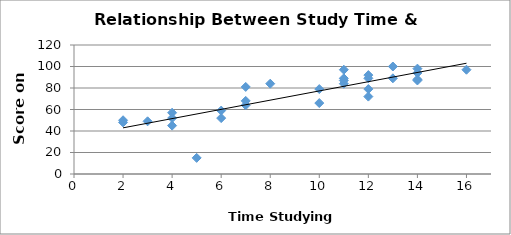
| Category | Score on Test |
|---|---|
| 3.0 | 49 |
| 11.0 | 87 |
| 2.0 | 50 |
| 13.0 | 89 |
| 8.0 | 84 |
| 12.0 | 79 |
| 13.0 | 100 |
| 4.0 | 57 |
| 7.0 | 64 |
| 14.0 | 98 |
| 7.0 | 81 |
| 7.0 | 68 |
| 14.0 | 88 |
| 4.0 | 45 |
| 4.0 | 52 |
| 5.0 | 15 |
| 12.0 | 72 |
| 16.0 | 97 |
| 12.0 | 89 |
| 14.0 | 87 |
| 2.0 | 48 |
| 12.0 | 92 |
| 11.0 | 89 |
| 6.0 | 52 |
| 11.0 | 84 |
| 14.0 | 94 |
| 10.0 | 79 |
| 6.0 | 59 |
| 10.0 | 66 |
| 11.0 | 97 |